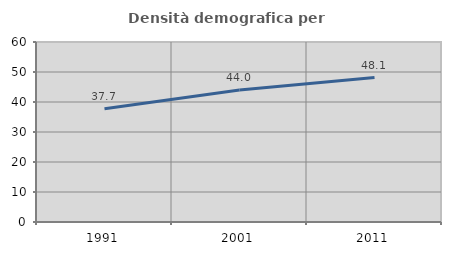
| Category | Densità demografica |
|---|---|
| 1991.0 | 37.739 |
| 2001.0 | 44.009 |
| 2011.0 | 48.15 |